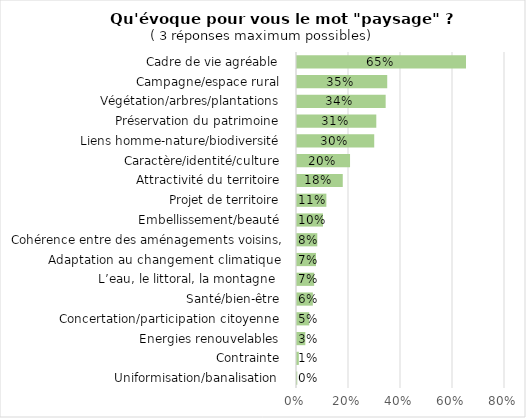
| Category | Series 0 |
|---|---|
| Uniformisation/banalisation  | 0.001 |
| Contrainte  | 0.007 |
| Energies renouvelables  | 0.032 |
| Concertation/participation citoyenne  | 0.047 |
| Santé/bien-être  | 0.061 |
| L’eau, le littoral, la montagne   | 0.066 |
| Adaptation au changement climatique  | 0.073 |
| Cohérence entre des aménagements voisins,  | 0.078 |
| Embellissement/beauté  | 0.1 |
| Projet de territoire  | 0.113 |
| Attractivité du territoire  | 0.176 |
| Caractère/identité/culture  | 0.204 |
| Liens homme-nature/biodiversité  | 0.297 |
| Préservation du patrimoine  | 0.305 |
| Végétation/arbres/plantations  | 0.341 |
| Campagne/espace rural  | 0.347 |
| Cadre de vie agréable  | 0.65 |